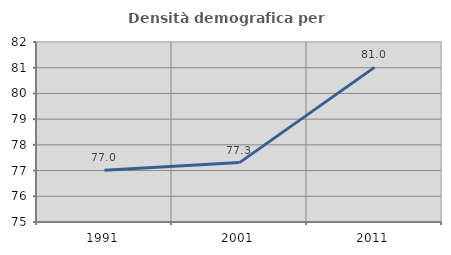
| Category | Densità demografica |
|---|---|
| 1991.0 | 77.011 |
| 2001.0 | 77.31 |
| 2011.0 | 81.013 |